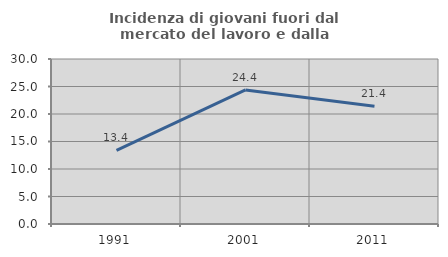
| Category | Incidenza di giovani fuori dal mercato del lavoro e dalla formazione  |
|---|---|
| 1991.0 | 13.4 |
| 2001.0 | 24.382 |
| 2011.0 | 21.397 |